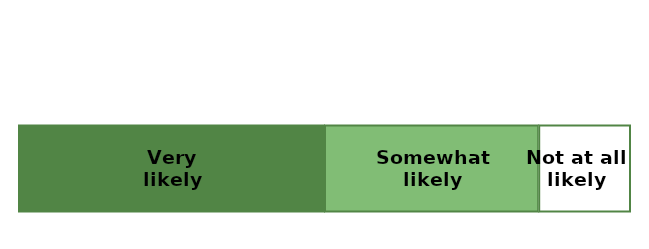
| Category | Very likely | Somewhat likely | Not at all likely |
|---|---|---|---|
| 0 | 0.5 | 0.35 | 0.15 |